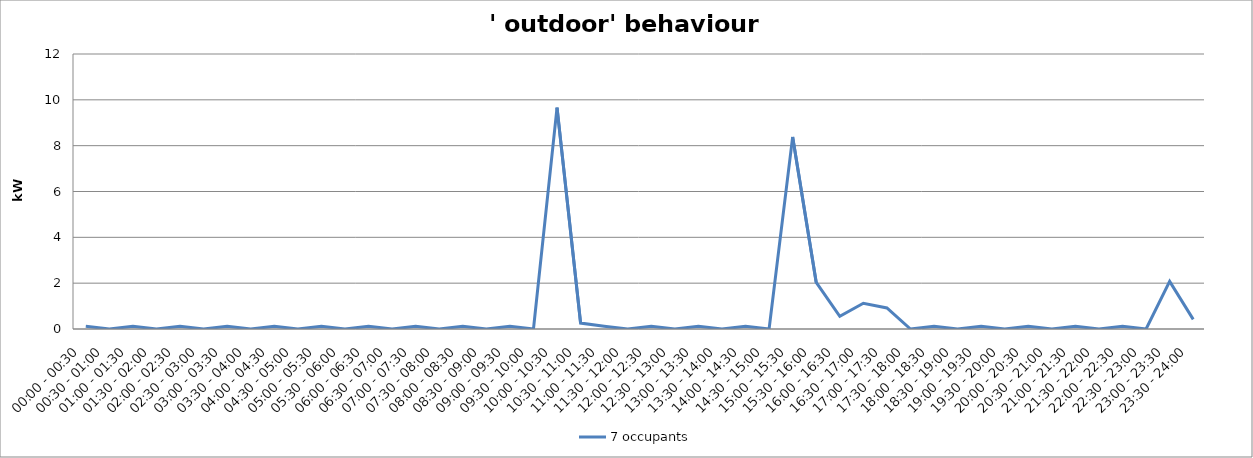
| Category | 7 occupants |
|---|---|
| 00:00 - 00:30 | 0.121 |
| 00:30 - 01:00 | 0 |
| 01:00 - 01:30 | 0.121 |
| 01:30 - 02:00 | 0 |
| 02:00 - 02:30 | 0.121 |
| 02:30 - 03:00 | 0 |
| 03:00 - 03:30 | 0.121 |
| 03:30 - 04:00 | 0 |
| 04:00 - 04:30 | 0.121 |
| 04:30 - 05:00 | 0 |
| 05:00 - 05:30 | 0.121 |
| 05:30 - 06:00 | 0 |
| 06:00 - 06:30 | 0.121 |
| 06:30 - 07:00 | 0 |
| 07:00 - 07:30 | 0.121 |
| 07:30 - 08:00 | 0 |
| 08:00 - 08:30 | 0.121 |
| 08:30 - 09:00 | 0 |
| 09:00 - 09:30 | 0.121 |
| 09:30 - 10:00 | 0 |
| 10:00 - 10:30 | 9.659 |
| 10:30 - 11:00 | 0.259 |
| 11:00 - 11:30 | 0.121 |
| 11:30 - 12:00 | 0 |
| 12:00 - 12:30 | 0.121 |
| 12:30 - 13:00 | 0 |
| 13:00 - 13:30 | 0.121 |
| 13:30 - 14:00 | 0 |
| 14:00 - 14:30 | 0.121 |
| 14:30 - 15:00 | 0 |
| 15:00 - 15:30 | 8.383 |
| 15:30 - 16:00 | 2.033 |
| 16:00 - 16:30 | 0.554 |
| 16:30 - 17:00 | 1.123 |
| 17:00 - 17:30 | 0.921 |
| 17:30 - 18:00 | 0 |
| 18:00 - 18:30 | 0.121 |
| 18:30 - 19:00 | 0 |
| 19:00 - 19:30 | 0.121 |
| 19:30 - 20:00 | 0 |
| 20:00 - 20:30 | 0.121 |
| 20:30 - 21:00 | 0 |
| 21:00 - 21:30 | 0.121 |
| 21:30 - 22:00 | 0 |
| 22:00 - 22:30 | 0.121 |
| 22:30 - 23:00 | 0 |
| 23:00 - 23:30 | 2.08 |
| 23:30 - 24:00 | 0.419 |